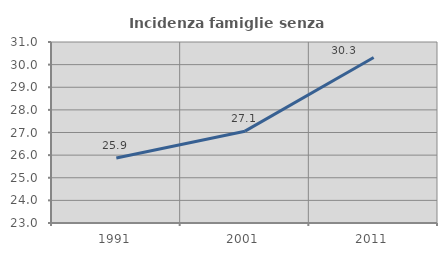
| Category | Incidenza famiglie senza nuclei |
|---|---|
| 1991.0 | 25.873 |
| 2001.0 | 27.059 |
| 2011.0 | 30.314 |